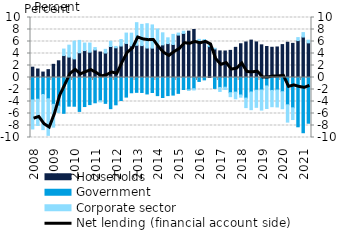
| Category | Households | Government | Corporate sector |
|---|---|---|---|
| 2008.0 | 1.722 | -3.74 | -4.839 |
| 2008.0 | 1.415 | -3.619 | -4.375 |
| 2008.0 | 0.905 | -2.834 | -5.853 |
| 2008.0 | 1.31 | -3.544 | -6.1 |
| 2009.0 | 2.195 | -4.472 | -3.8 |
| 2009.0 | 2.783 | -4.768 | -1.071 |
| 2009.0 | 3.659 | -5.969 | 1.081 |
| 2009.0 | 3.404 | -4.777 | 1.984 |
| 2010.0 | 3.104 | -4.789 | 2.953 |
| 2010.0 | 4.125 | -5.653 | 2.057 |
| 2010.0 | 4.487 | -4.841 | 1.254 |
| 2010.0 | 4.224 | -4.513 | 1.517 |
| 2011.0 | 4.593 | -4.218 | 0.395 |
| 2011.0 | 4.248 | -3.88 | -0.191 |
| 2011.0 | 4.081 | -4.31 | 0.612 |
| 2011.0 | 5.163 | -5.194 | 0.864 |
| 2012.0 | 4.949 | -4.553 | 0.228 |
| 2012.0 | 5.248 | -3.834 | 1.073 |
| 2012.0 | 5.679 | -3.266 | 1.724 |
| 2012.0 | 5.284 | -2.545 | 2.105 |
| 2013.0 | 5.378 | -2.474 | 3.759 |
| 2013.0 | 5.317 | -2.495 | 3.536 |
| 2013.0 | 4.91 | -2.742 | 4.057 |
| 2013.0 | 4.897 | -2.503 | 3.868 |
| 2014.0 | 5.308 | -3.022 | 2.777 |
| 2014.0 | 5.439 | -3.337 | 2.01 |
| 2014.0 | 5.65 | -3.015 | 0.964 |
| 2014.0 | 5.501 | -2.932 | 1.685 |
| 2015.0 | 7.073 | -2.642 | 0.332 |
| 2015.0 | 7.35 | -1.999 | 0.359 |
| 2015.0 | 7.728 | -2.071 | -0.021 |
| 2015.0 | 8.002 | -1.871 | -0.208 |
| 2016.0 | 6.141 | -0.656 | 0.214 |
| 2016.0 | 5.819 | -0.393 | 0.517 |
| 2016.0 | 5.147 | 0.088 | 0.269 |
| 2016.0 | 4.761 | -1.817 | 0.106 |
| 2017.0 | 4.434 | -1.659 | -0.667 |
| 2017.0 | 4.418 | -1.617 | -0.384 |
| 2017.0 | 4.52 | -2.536 | -0.656 |
| 2017.0 | 5.026 | -2.44 | -1.109 |
| 2018.0 | 5.623 | -2.913 | -0.367 |
| 2018.0 | 5.922 | -3.431 | -1.584 |
| 2018.0 | 6.232 | -2.413 | -2.948 |
| 2018.0 | 5.931 | -2.12 | -2.85 |
| 2019.0 | 5.442 | -2.087 | -3.345 |
| 2019.0 | 5.164 | -1.409 | -3.755 |
| 2019.0 | 5.037 | -2.153 | -2.714 |
| 2019.0 | 5.088 | -2.085 | -2.825 |
| 2020.0 | 5.484 | -2.374 | -2.83 |
| 2020.0 | 5.874 | -4.553 | -2.882 |
| 2020.0 | 5.689 | -5.056 | -1.951 |
| 2020.0 | 6.151 | -8.216 | 0.498 |
| 2021.0 | 6.74 | -9.203 | 0.743 |
| 2021.0 | 5.775 | -7.623 | 0.445 |